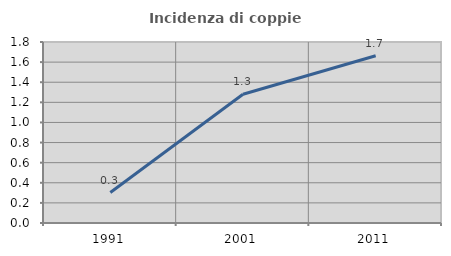
| Category | Incidenza di coppie miste |
|---|---|
| 1991.0 | 0.303 |
| 2001.0 | 1.28 |
| 2011.0 | 1.663 |